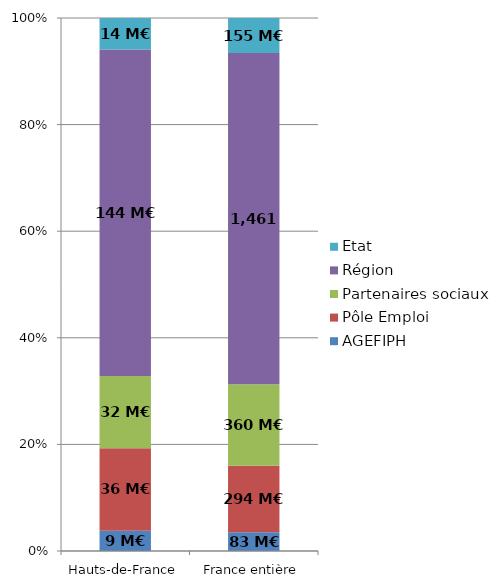
| Category | AGEFIPH | Pôle Emploi | Partenaires sociaux | Région | Etat |
|---|---|---|---|---|---|
| Hauts-de-France | 8.942 | 36.226 | 31.847 | 143.536 | 13.846 |
| France entière | 82.716 | 293.959 | 359.593 | 1461.057 | 154.74 |